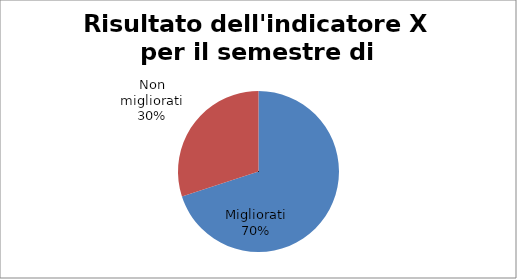
| Category | Series 0 | Series 1 |
|---|---|---|
| 0 | 70 | 0 |
| 1 | 30 | 0 |